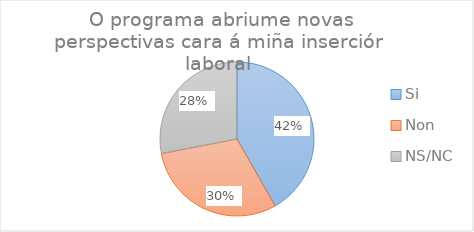
| Category | Series 25 |
|---|---|
| Si | 58 |
| Non | 42 |
| NS/NC | 39 |